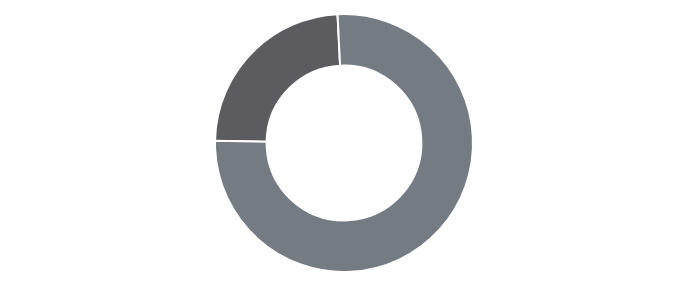
| Category | Series 0 |
|---|---|
| 0 | 327333 |
| 1 | 1040940 |